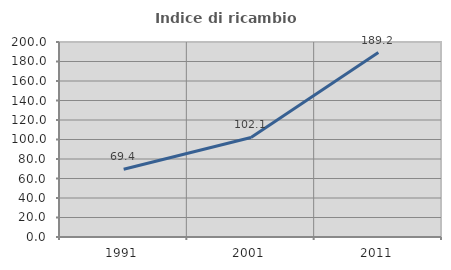
| Category | Indice di ricambio occupazionale  |
|---|---|
| 1991.0 | 69.424 |
| 2001.0 | 102.101 |
| 2011.0 | 189.172 |